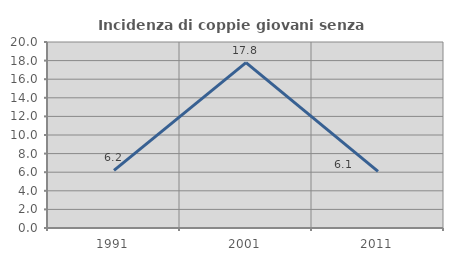
| Category | Incidenza di coppie giovani senza figli |
|---|---|
| 1991.0 | 6.195 |
| 2001.0 | 17.778 |
| 2011.0 | 6.098 |